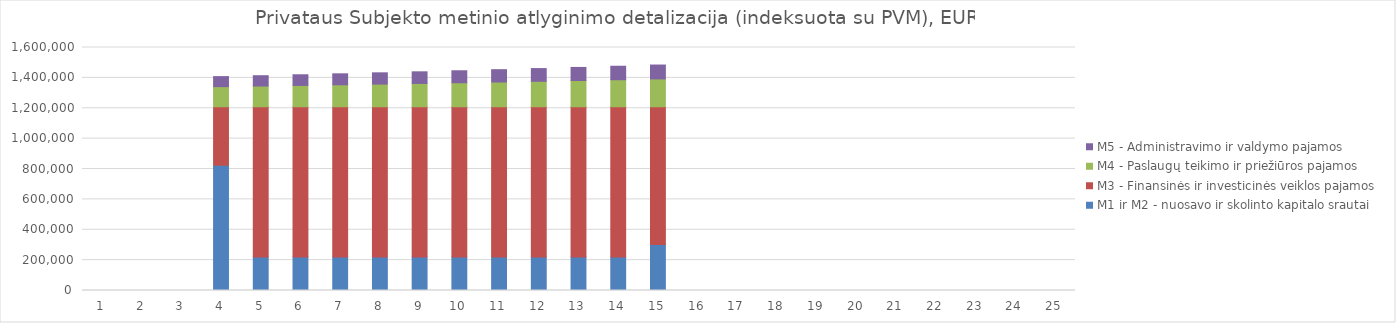
| Category | M1 ir M2 - nuosavo ir skolinto kapitalo srautai | M3 - Finansinės ir investicinės veiklos pajamos | M4 - Paslaugų teikimo ir priežiūros pajamos | M5 - Administravimo ir valdymo pajamos |
|---|---|---|---|---|
| 1.0 | 0 | 0 | 0 | 0 |
| 2.0 | 0 | 0 | 0 | 0 |
| 3.0 | 0 | 0 | 0 | 0 |
| 4.0 | 824999.78 | 385000.22 | 132220.33 | 66109.56 |
| 5.0 | 219999.78 | 990000.22 | 136186.71 | 68092.75 |
| 6.0 | 219999.78 | 990000.22 | 140271.67 | 70136.44 |
| 7.0 | 219999.78 | 990000.22 | 144480.05 | 72240.63 |
| 8.0 | 219999.78 | 990000.22 | 148814.27 | 74407.74 |
| 9.0 | 219999.78 | 990000.22 | 153279.17 | 76640.19 |
| 10.0 | 219999.78 | 990000.22 | 157877.17 | 78939.19 |
| 11.0 | 219999.78 | 990000.22 | 162614.32 | 81307.16 |
| 12.0 | 219999.78 | 990000.22 | 167491.83 | 83746.52 |
| 13.0 | 219999.78 | 990000.22 | 172516.96 | 86258.48 |
| 14.0 | 219999.78 | 990000.22 | 177692.13 | 88846.67 |
| 15.0 | 302500 | 907500 | 183023.39 | 91511.09 |
| 16.0 | 0 | 0 | 0 | 0 |
| 17.0 | 0 | 0 | 0 | 0 |
| 18.0 | 0 | 0 | 0 | 0 |
| 19.0 | 0 | 0 | 0 | 0 |
| 20.0 | 0 | 0 | 0 | 0 |
| 21.0 | 0 | 0 | 0 | 0 |
| 22.0 | 0 | 0 | 0 | 0 |
| 23.0 | 0 | 0 | 0 | 0 |
| 24.0 | 0 | 0 | 0 | 0 |
| 25.0 | 0 | 0 | 0 | 0 |